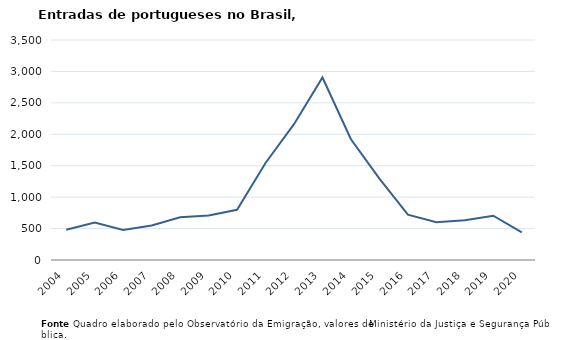
| Category | Entradas |
|---|---|
| 2004.0 | 482 |
| 2005.0 | 595 |
| 2006.0 | 477 |
| 2007.0 | 550 |
| 2008.0 | 679 |
| 2009.0 | 708 |
| 2010.0 | 798 |
| 2011.0 | 1543 |
| 2012.0 | 2161 |
| 2013.0 | 2904 |
| 2014.0 | 1921 |
| 2015.0 | 1294 |
| 2016.0 | 722 |
| 2017.0 | 601 |
| 2018.0 | 631 |
| 2019.0 | 705 |
| 2020.0 | 439 |